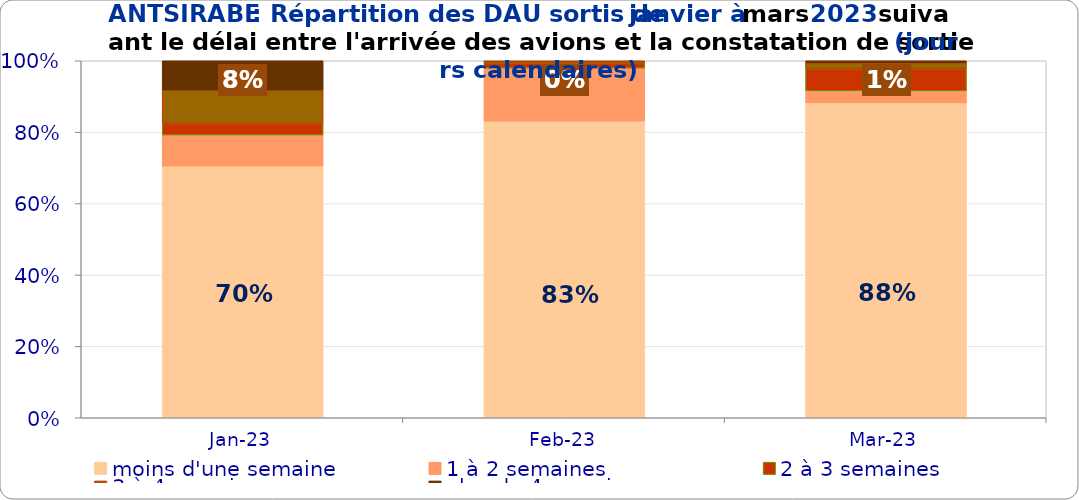
| Category | moins d'une semaine | 1 à 2 semaines | 2 à 3 semaines | 3 à 4 semaines | plus de 4 semaines |
|---|---|---|---|---|---|
| 2023-01-01 | 0.705 | 0.087 | 0.033 | 0.093 | 0.082 |
| 2023-02-01 | 0.831 | 0.149 | 0.014 | 0.007 | 0 |
| 2023-03-01 | 0.882 | 0.034 | 0.062 | 0.017 | 0.006 |